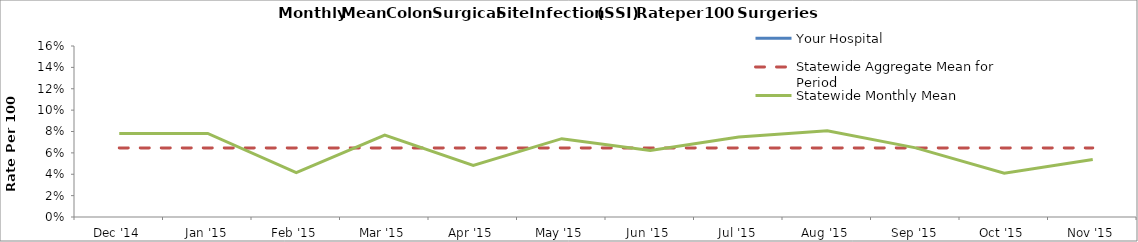
| Category | Your Hospital | Statewide Aggregate Mean for Period | Statewide Monthly Mean |
|---|---|---|---|
| Dec '14 |  | 0.065 | 0.078 |
| Jan '15 |  | 0.065 | 0.078 |
| Feb '15 |  | 0.065 | 0.042 |
| Mar '15 |  | 0.065 | 0.077 |
| Apr '15 |  | 0.065 | 0.048 |
| May '15 |  | 0.065 | 0.073 |
| Jun '15 |  | 0.065 | 0.062 |
| Jul '15 |  | 0.065 | 0.075 |
| Aug '15 |  | 0.065 | 0.081 |
| Sep '15 |  | 0.065 | 0.065 |
| Oct '15 |  | 0.065 | 0.041 |
| Nov '15 |  | 0.065 | 0.054 |